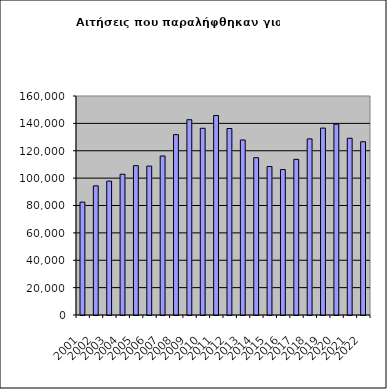
| Category | Series 0 |
|---|---|
| 2001.0 | 82454 |
| 2002.0 | 94358 |
| 2003.0 | 97793 |
| 2004.0 | 102813 |
| 2005.0 | 109089 |
| 2006.0 | 108785 |
| 2007.0 | 116159 |
| 2008.0 | 131779 |
| 2009.0 | 142663 |
| 2010.0 | 136417 |
| 2011.0 | 145734 |
| 2012.0 | 136250 |
| 2013.0 | 127876 |
| 2014.0 | 114913 |
| 2015.0 | 108465 |
| 2016.0 | 106273 |
| 2017.0 | 113720 |
| 2018.0 | 128673 |
| 2019.0 | 136561 |
| 2020.0 | 139390 |
| 2021.0 | 129115 |
| 2022.0 | 126580 |